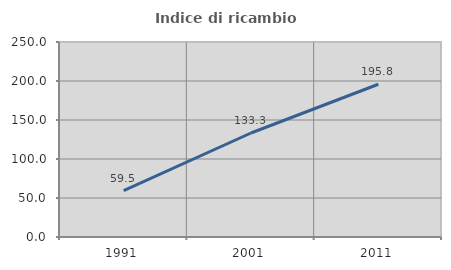
| Category | Indice di ricambio occupazionale  |
|---|---|
| 1991.0 | 59.459 |
| 2001.0 | 133.333 |
| 2011.0 | 195.833 |